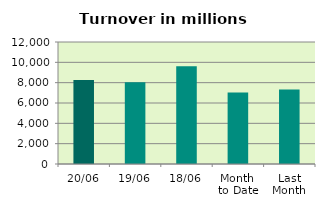
| Category | Series 0 |
|---|---|
| 20/06 | 8261.446 |
| 19/06 | 8048.028 |
| 18/06 | 9607.465 |
| Month 
to Date | 7034.335 |
| Last
Month | 7336.2 |